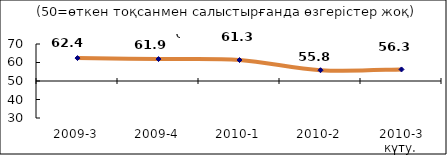
| Category | Диф.индекс ↓ |
|---|---|
| 2009-3 | 62.395 |
| 2009-4 | 61.865 |
| 2010-1 | 61.34 |
| 2010-2 | 55.83 |
| 2010-3 күту. | 56.25 |